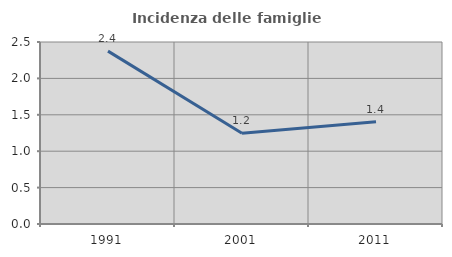
| Category | Incidenza delle famiglie numerose |
|---|---|
| 1991.0 | 2.374 |
| 2001.0 | 1.246 |
| 2011.0 | 1.406 |